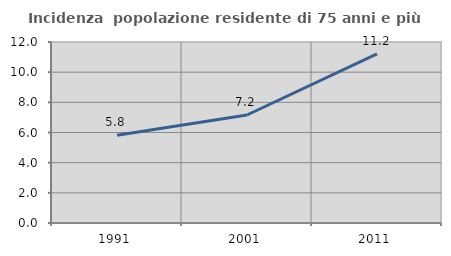
| Category | Incidenza  popolazione residente di 75 anni e più |
|---|---|
| 1991.0 | 5.815 |
| 2001.0 | 7.16 |
| 2011.0 | 11.211 |